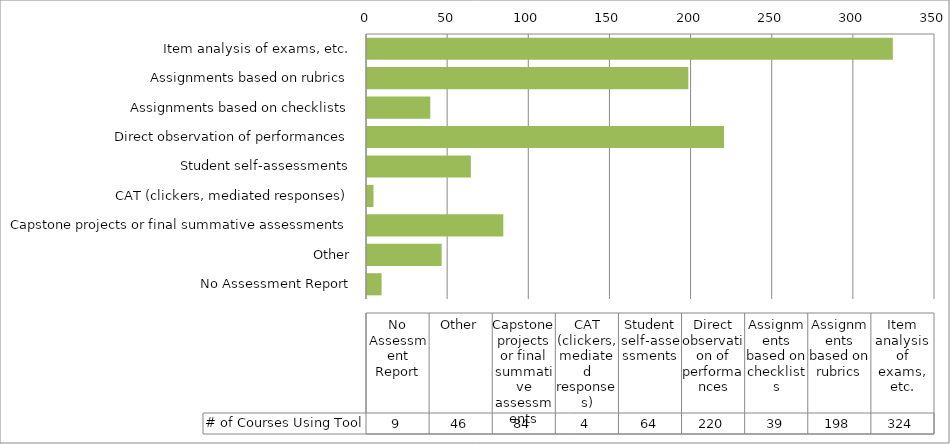
| Category | # of Courses Using Tool |
|---|---|
| Item analysis of exams, etc. | 324 |
| Assignments based on rubrics | 198 |
| Assignments based on checklists | 39 |
| Direct observation of performances | 220 |
| Student self-assessments | 64 |
| CAT (clickers, mediated responses) | 4 |
| Capstone projects or final summative assessments | 84 |
| Other | 46 |
| No Assessment Report | 9 |